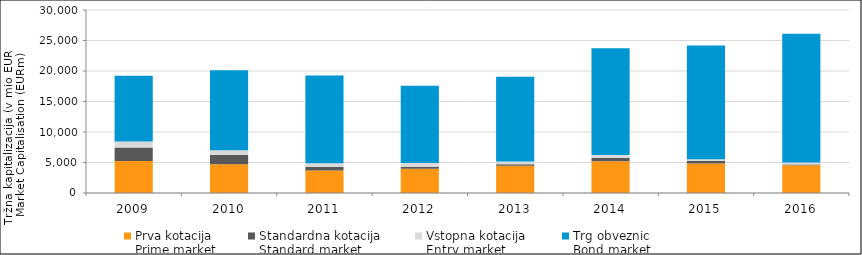
| Category | Prva kotacija
Prime market | Standardna kotacija
Standard market | Vstopna kotacija
Entry market | Trg obveznic
Bond market |
|---|---|---|---|---|
| 2009 | 5247.537 | 2206.925 | 1007.755 | 10738.705 |
| 2010 | 4713.896 | 1498.485 | 815.511 | 13104.825 |
| 2011 | 3696.052 | 578.188 | 598.573 | 14379.266 |
| 2012 | 3991.719 | 317.841 | 601.607 | 12666.937 |
| 2013 | 4487.491 | 234.914 | 450.705 | 13901.489 |
| 2014 | 5217.088 | 580.923 | 416.026 | 17520.162 |
| 2015 | 4848.965 | 413.935 | 260.324 | 18645.355 |
| 2016 | 4563.063 | 118.82 | 317.962 | 21117.228 |